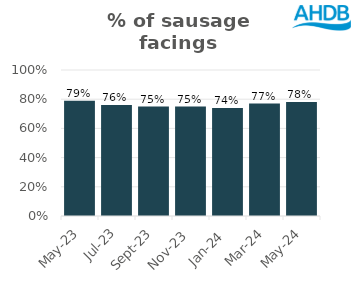
| Category | Sausage |
|---|---|
| 2023-05-01 | 0.79 |
| 2023-07-01 | 0.76 |
| 2023-09-01 | 0.75 |
| 2023-11-01 | 0.75 |
| 2024-01-01 | 0.74 |
| 2024-03-01 | 0.77 |
| 2024-05-01 | 0.78 |